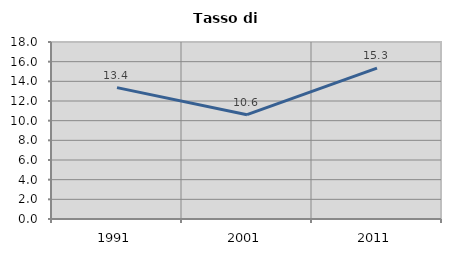
| Category | Tasso di disoccupazione   |
|---|---|
| 1991.0 | 13.359 |
| 2001.0 | 10.606 |
| 2011.0 | 15.341 |